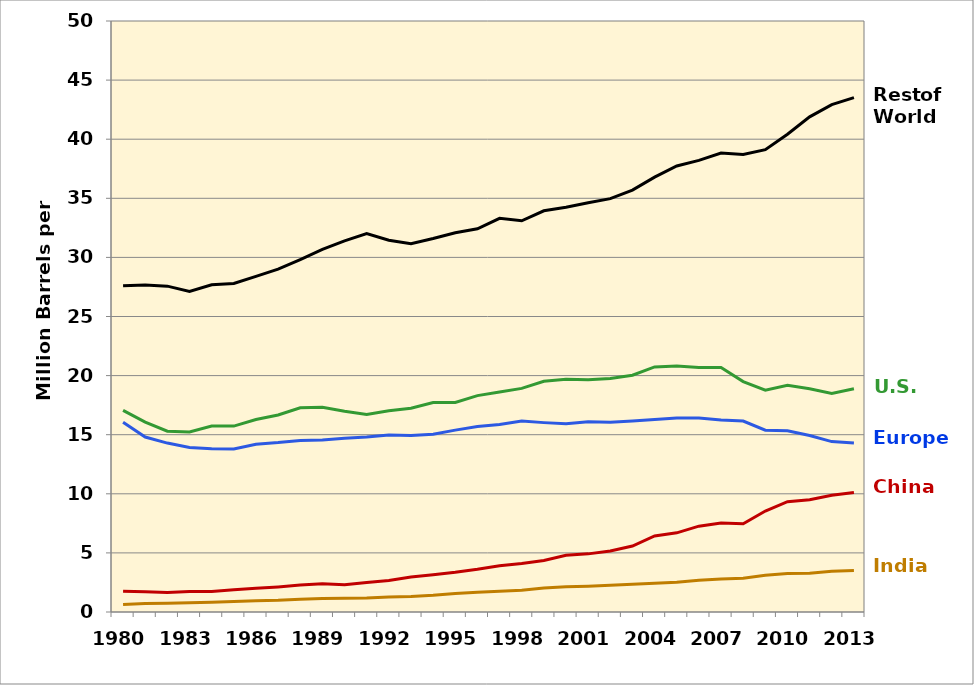
| Category | United States | Europe | China | India | Rest of World | Series 3 |
|---|---|---|---|---|---|---|
| 1980.0 | 17.056 | 16.056 | 1.765 | 0.643 | 27.599 |  |
| 1981.0 | 16.058 | 14.804 | 1.705 | 0.729 | 27.658 |  |
| 1982.0 | 15.296 | 14.29 | 1.66 | 0.737 | 27.569 |  |
| 1983.0 | 15.231 | 13.926 | 1.73 | 0.773 | 27.123 |  |
| 1984.0 | 15.726 | 13.818 | 1.74 | 0.824 | 27.687 |  |
| 1985.0 | 15.726 | 13.79 | 1.885 | 0.895 | 27.788 |  |
| 1986.0 | 16.281 | 14.193 | 2 | 0.947 | 28.399 |  |
| 1987.0 | 16.665 | 14.333 | 2.12 | 0.988 | 29.001 |  |
| 1988.0 | 17.283 | 14.515 | 2.275 | 1.084 | 29.82 |  |
| 1989.0 | 17.325 | 14.557 | 2.38 | 1.15 | 30.678 |  |
| 1990.0 | 16.988 | 14.695 | 2.296 | 1.168 | 31.402 |  |
| 1991.0 | 16.714 | 14.8 | 2.499 | 1.19 | 32.012 |  |
| 1992.0 | 17.033 | 14.969 | 2.662 | 1.275 | 31.446 |  |
| 1993.0 | 17.237 | 14.928 | 2.959 | 1.311 | 31.155 |  |
| 1994.0 | 17.718 | 15.044 | 3.161 | 1.413 | 31.593 |  |
| 1995.0 | 17.725 | 15.386 | 3.363 | 1.575 | 32.084 |  |
| 1996.0 | 18.309 | 15.692 | 3.61 | 1.681 | 32.422 |  |
| 1997.0 | 18.62 | 15.855 | 3.916 | 1.765 | 33.308 |  |
| 1998.0 | 18.917 | 16.154 | 4.106 | 1.844 | 33.096 |  |
| 1999.0 | 19.519 | 16.022 | 4.364 | 2.031 | 33.944 |  |
| 2000.0 | 19.701 | 15.921 | 4.796 | 2.127 | 34.242 |  |
| 2001.0 | 19.649 | 16.096 | 4.918 | 2.184 | 34.631 |  |
| 2002.0 | 19.761 | 16.061 | 5.161 | 2.263 | 34.97 |  |
| 2003.0 | 20.034 | 16.155 | 5.578 | 2.346 | 35.695 |  |
| 2004.0 | 20.731 | 16.28 | 6.437 | 2.43 | 36.792 |  |
| 2005.0 | 20.802 | 16.403 | 6.695 | 2.512 | 37.737 |  |
| 2006.0 | 20.687 | 16.422 | 7.263 | 2.691 | 38.207 |  |
| 2007.0 | 20.68 | 16.241 | 7.534 | 2.801 | 38.832 |  |
| 2008.0 | 19.498 | 16.151 | 7.468 | 2.864 | 38.716 |  |
| 2009.0 | 18.771 | 15.376 | 8.54 | 3.113 | 39.119 |  |
| 2010.0 | 19.18 | 15.338 | 9.33 | 3.255 | 40.425 |  |
| 2011.0 | 18.882 | 14.93 | 9.504 | 3.281 | 41.894 |  |
| 2012.0 | 18.49 | 14.416 | 9.875 | 3.45 | 42.928 |  |
| 2013.0 | 18.887 | 14.297 | 10.117 | 3.509 | 43.516 |  |